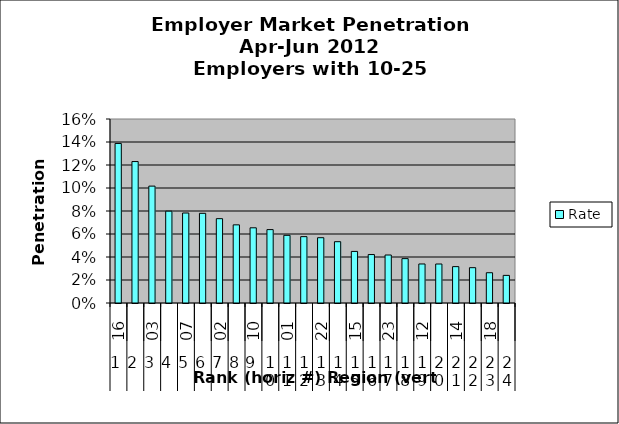
| Category | Rate |
|---|---|
| 0 | 0.139 |
| 1 | 0.123 |
| 2 | 0.102 |
| 3 | 0.08 |
| 4 | 0.078 |
| 5 | 0.078 |
| 6 | 0.073 |
| 7 | 0.068 |
| 8 | 0.065 |
| 9 | 0.064 |
| 10 | 0.059 |
| 11 | 0.058 |
| 12 | 0.057 |
| 13 | 0.053 |
| 14 | 0.045 |
| 15 | 0.042 |
| 16 | 0.042 |
| 17 | 0.039 |
| 18 | 0.034 |
| 19 | 0.034 |
| 20 | 0.032 |
| 21 | 0.031 |
| 22 | 0.026 |
| 23 | 0.024 |